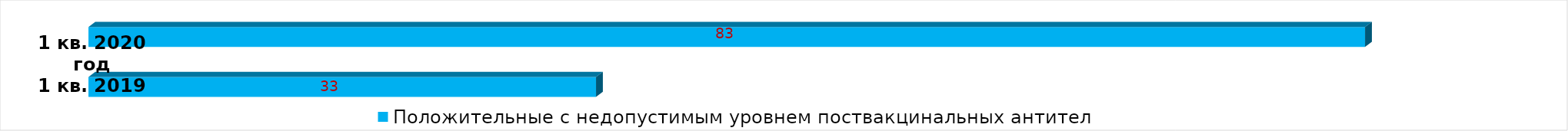
| Category | Положительные с недопустимым уровнем поствакцинальных антител |
|---|---|
| Положительные с недопустимым уровнем поствакцинальных антител | 33 |